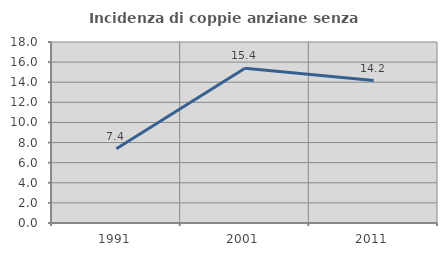
| Category | Incidenza di coppie anziane senza figli  |
|---|---|
| 1991.0 | 7.38 |
| 2001.0 | 15.385 |
| 2011.0 | 14.17 |